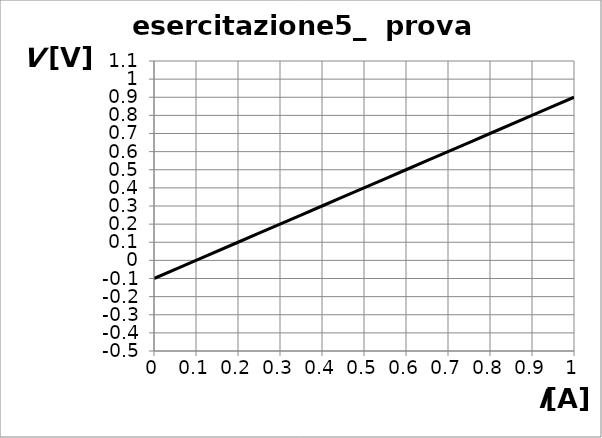
| Category | Series 0 |
|---|---|
| 0.0 | -0.1 |
| 0.1 | 0 |
| 0.2 | 0.1 |
| 0.30000000000000004 | 0.2 |
| 0.4 | 0.3 |
| 0.5 | 0.4 |
| 0.6 | 0.5 |
| 0.7 | 0.6 |
| 0.7999999999999999 | 0.7 |
| 0.8999999999999999 | 0.8 |
| 0.9999999999999999 | 0.9 |